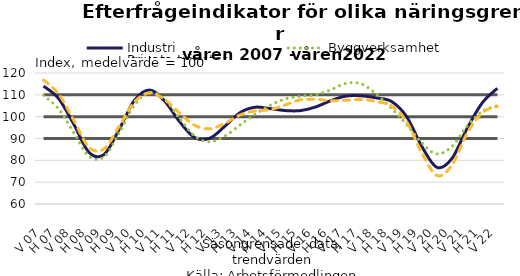
| Category | Normalt | Mycket svagare än normalt | Mycket starkare än normalt | Industri | Byggverksamhet | Privata tjänster |
|---|---|---|---|---|---|---|
| V 07 | 100 | 90 | 110 | 114 | 109.8 | 116.81 |
| H 07 | 100 | 90 | 110 | 108.26 | 103.51 | 110.33 |
| V 08 | 100 | 90 | 110 | 96.51 | 92.63 | 98.28 |
| H 08 | 100 | 90 | 110 | 83.66 | 81.81 | 85.95 |
| V 09 | 100 | 90 | 110 | 82.67 | 81.69 | 85.25 |
| H 09 | 100 | 90 | 110 | 94.25 | 92.58 | 95.6 |
| V 10 | 100 | 90 | 110 | 107.4 | 105.26 | 106.68 |
| H 10 | 100 | 90 | 110 | 112.19 | 111.08 | 110.88 |
| V 11 | 100 | 90 | 110 | 107.17 | 107.89 | 107.88 |
| H 11 | 100 | 90 | 110 | 97.61 | 99.1 | 101.57 |
| V 12 | 100 | 90 | 110 | 90.37 | 91.03 | 96.01 |
| H 12 | 100 | 90 | 110 | 90.17 | 88.52 | 94.44 |
| V 13 | 100 | 90 | 110 | 95.72 | 91.17 | 96.98 |
| H 13 | 100 | 90 | 110 | 101.9 | 96.25 | 100.81 |
| V 14 | 100 | 90 | 110 | 104.33 | 101.17 | 102.61 |
| H 14 | 100 | 90 | 110 | 103.67 | 105.27 | 103.26 |
| V 15 | 100 | 90 | 110 | 102.78 | 108.15 | 105.46 |
| H 15 | 100 | 90 | 110 | 102.79 | 109.34 | 107.72 |
| V 16 | 100 | 90 | 110 | 104.48 | 110.06 | 107.96 |
| H 16 | 100 | 90 | 110 | 107.37 | 112.36 | 107.3 |
| V 17 | 100 | 90 | 110 | 109.44 | 115.26 | 107.51 |
| H 17 | 100 | 90 | 110 | 109.55 | 115.03 | 107.85 |
| V 18 | 100 | 90 | 110 | 108.59 | 110.28 | 106.93 |
| H 18 | 100 | 90 | 110 | 106.95 | 103.76 | 104.91 |
| V 19 | 100 | 90 | 110 | 99.99 | 96.4 | 97.62 |
| H 19 | 100 | 90 | 110 | 86.4 | 87.96 | 83.47 |
| V 20 | 100 | 90 | 110 | 76.77 | 82.94 | 73.04 |
| H 20 | 100 | 90 | 110 | 80.9 | 86.45 | 77.93 |
| V 21 | 100 | 90 | 110 | 94.7 | 95.72 | 92.43 |
| H 21 | 100 | 90 | 110 | 106.36 | 102.4 | 101.87 |
| V 22 | 100 | 90 | 110 | 113.01 | 105.14 | 104.67 |